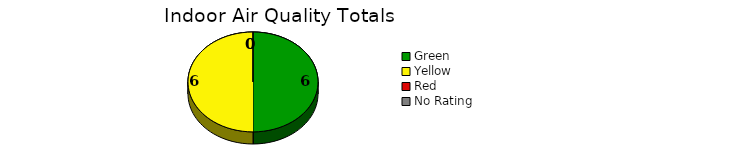
| Category | Series 0 |
|---|---|
| Green | 6 |
| Yellow | 6 |
| Red | 0 |
| No Rating | 0 |